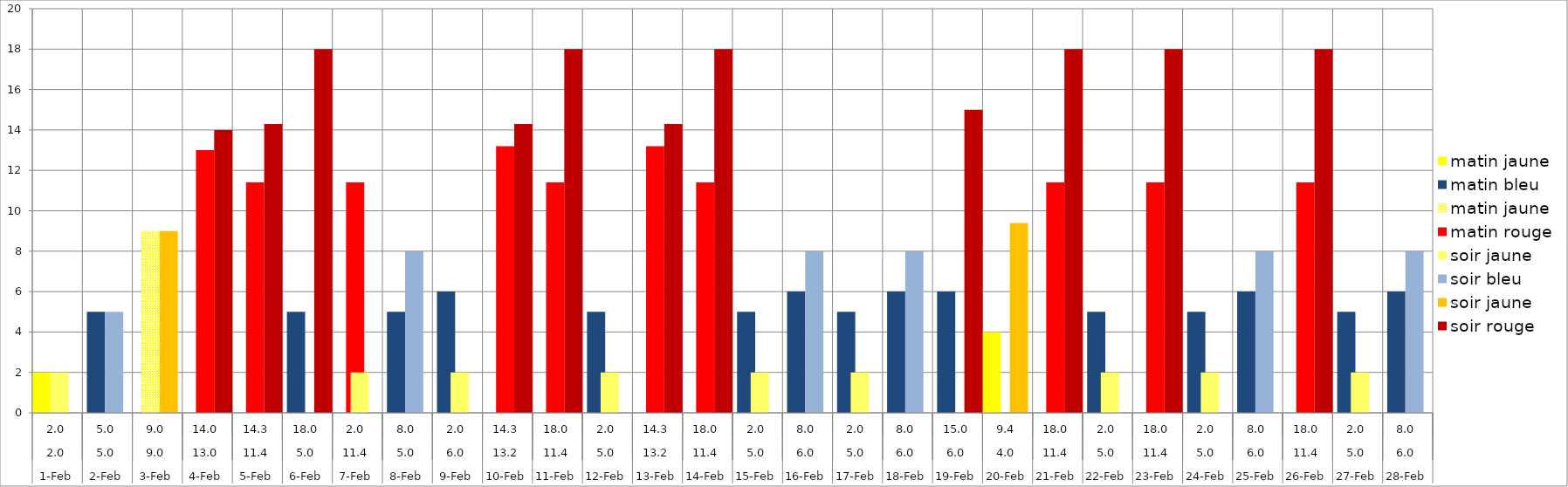
| Category | matin jaune | matin bleu | matin rouge | soir jaune | soir bleu | soir rouge |
|---|---|---|---|---|---|---|
| 0 | 0 | 0 | 0 | 0 | 0 | 0 |
| 1 | 0 | 5 | 0 | 0 | 5 | 0 |
| 2 | 9 | 0 | 0 | 9 | 0 | 0 |
| 3 | 0 | 0 | 13 | 0 | 0 | 14 |
| 4 | 0 | 0 | 11.4 | 0 | 0 | 14.3 |
| 5 | 0 | 5 | 0 | 0 | 0 | 18 |
| 6 | 0 | 0 | 11.4 | 0 | 0 | 0 |
| 7 | 0 | 5 | 0 | 0 | 8 | 0 |
| 8 | 0 | 6 | 0 | 0 | 0 | 0 |
| 9 | 0 | 0 | 13.2 | 0 | 0 | 14.3 |
| 10 | 0 | 0 | 11.4 | 0 | 0 | 18 |
| 11 | 0 | 5 | 0 | 0 | 0 | 0 |
| 12 | 0 | 0 | 13.2 | 0 | 0 | 14.3 |
| 13 | 0 | 0 | 11.4 | 0 | 0 | 18 |
| 14 | 0 | 5 | 0 | 0 | 0 | 0 |
| 15 | 0 | 6 | 0 | 0 | 8 | 0 |
| 16 | 0 | 5 | 0 | 0 | 0 | 0 |
| 17 | 0 | 6 | 0 | 0 | 8 | 0 |
| 18 | 0 | 6 | 0 | 0 | 0 | 15 |
| 19 | 0 | 0 | 0 | 9.4 | 0 | 0 |
| 20 | 0 | 0 | 11.4 | 0 | 0 | 18 |
| 21 | 0 | 5 | 0 | 0 | 0 | 0 |
| 22 | 0 | 0 | 11.4 | 0 | 0 | 18 |
| 23 | 0 | 5 | 0 | 0 | 0 | 0 |
| 24 | 0 | 6 | 0 | 0 | 8 | 0 |
| 25 | 0 | 0 | 11.4 | 0 | 0 | 18 |
| 26 | 0 | 5 | 0 | 0 | 0 | 0 |
| 27 | 0 | 6 | 0 | 0 | 8 | 0 |